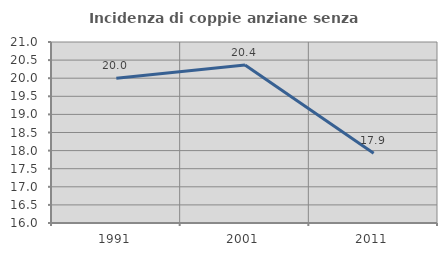
| Category | Incidenza di coppie anziane senza figli  |
|---|---|
| 1991.0 | 20 |
| 2001.0 | 20.362 |
| 2011.0 | 17.925 |